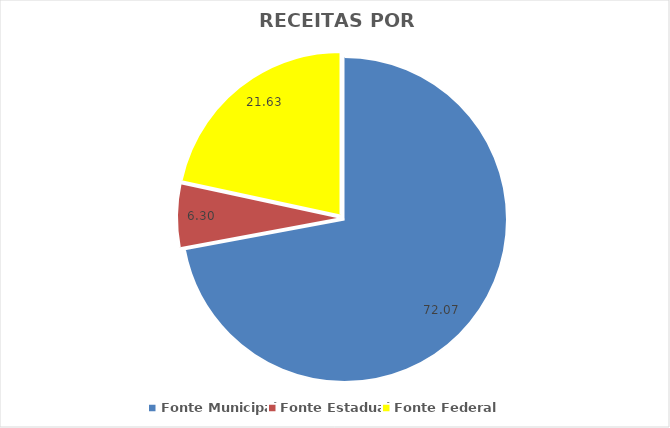
| Category | % |
|---|---|
| Fonte Municipal | 72.07 |
| Fonte Estadual | 6.3 |
| Fonte Federal | 21.63 |